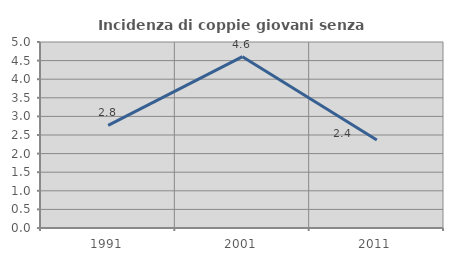
| Category | Incidenza di coppie giovani senza figli |
|---|---|
| 1991.0 | 2.759 |
| 2001.0 | 4.606 |
| 2011.0 | 2.364 |